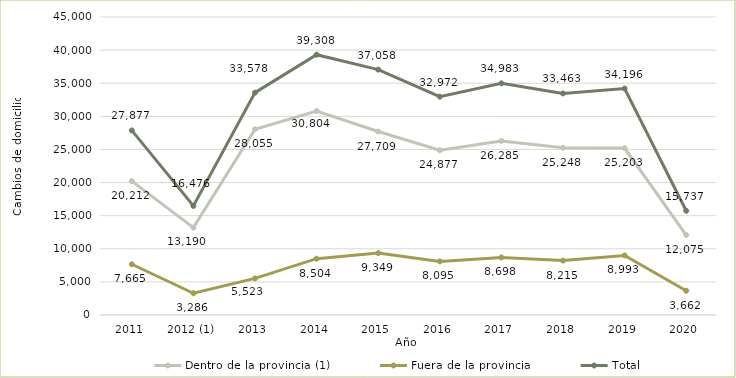
| Category | Dentro de la provincia (1) | Fuera de la provincia | Total |
|---|---|---|---|
| 2011 | 20212 | 7665 | 27877 |
| 2012 (1) | 13190 | 3286 | 16476 |
| 2013 | 28055 | 5523 | 33578 |
| 2014 | 30804 | 8504 | 39308 |
| 2015 | 27709 | 9349 | 37058 |
| 2016 | 24877 | 8095 | 32972 |
| 2017 | 26285 | 8698 | 34983 |
| 2018 | 25248 | 8215 | 33463 |
| 2019 | 25203 | 8993 | 34196 |
| 2020 | 12075 | 3662 | 15737 |